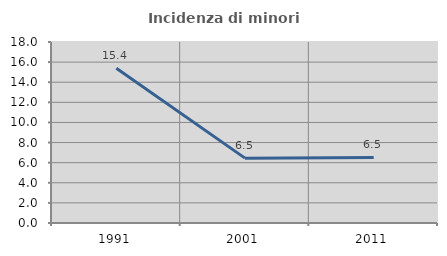
| Category | Incidenza di minori stranieri |
|---|---|
| 1991.0 | 15.385 |
| 2001.0 | 6.452 |
| 2011.0 | 6.522 |